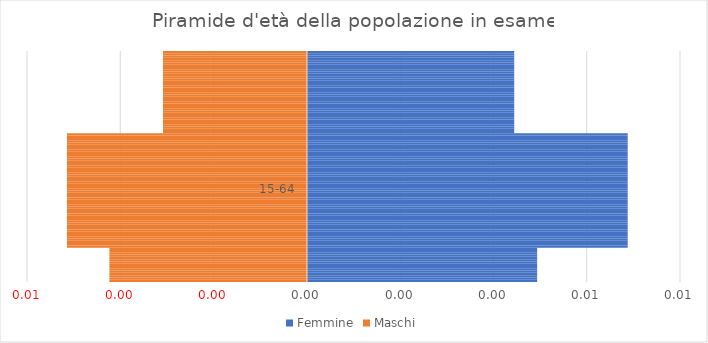
| Category | Femmine | Maschi |
|---|---|---|
|  | 0.005 | -0.004 |
|  | 0.005 | -0.004 |
|  | 0.005 | -0.004 |
|  | 0.005 | -0.004 |
|  | 0.005 | -0.004 |
|  | 0.005 | -0.004 |
|  | 0.005 | -0.004 |
| 0-14 | 0.005 | -0.004 |
|  | 0.005 | -0.004 |
|  | 0.005 | -0.004 |
|  | 0.005 | -0.004 |
|  | 0.005 | -0.004 |
|  | 0.005 | -0.004 |
|  | 0.005 | -0.004 |
|  | 0.005 | -0.004 |
|  | 0.007 | -0.005 |
|  | 0.007 | -0.005 |
|  | 0.007 | -0.005 |
|  | 0.007 | -0.005 |
|  | 0.007 | -0.005 |
|  | 0.007 | -0.005 |
|  | 0.007 | -0.005 |
|  | 0.007 | -0.005 |
|  | 0.007 | -0.005 |
|  | 0.007 | -0.005 |
|  | 0.007 | -0.005 |
|  | 0.007 | -0.005 |
|  | 0.007 | -0.005 |
|  | 0.007 | -0.005 |
|  | 0.007 | -0.005 |
|  | 0.007 | -0.005 |
|  | 0.007 | -0.005 |
|  | 0.007 | -0.005 |
|  | 0.007 | -0.005 |
|  | 0.007 | -0.005 |
|  | 0.007 | -0.005 |
|  | 0.007 | -0.005 |
|  | 0.007 | -0.005 |
|  | 0.007 | -0.005 |
|  | 0.007 | -0.005 |
| 15-64 | 0.007 | -0.005 |
|  | 0.007 | -0.005 |
|  | 0.007 | -0.005 |
|  | 0.007 | -0.005 |
|  | 0.007 | -0.005 |
|  | 0.007 | -0.005 |
|  | 0.007 | -0.005 |
|  | 0.007 | -0.005 |
|  | 0.007 | -0.005 |
|  | 0.007 | -0.005 |
|  | 0.007 | -0.005 |
|  | 0.007 | -0.005 |
|  | 0.007 | -0.005 |
|  | 0.007 | -0.005 |
|  | 0.007 | -0.005 |
|  | 0.007 | -0.005 |
|  | 0.007 | -0.005 |
|  | 0.007 | -0.005 |
|  | 0.007 | -0.005 |
|  | 0.007 | -0.005 |
|  | 0.007 | -0.005 |
|  | 0.007 | -0.005 |
|  | 0.007 | -0.005 |
|  | 0.007 | -0.005 |
|  | 0.007 | -0.005 |
|  | 0.004 | -0.003 |
|  | 0.004 | -0.003 |
|  | 0.004 | -0.003 |
|  | 0.004 | -0.003 |
|  | 0.004 | -0.003 |
|  | 0.004 | -0.003 |
|  | 0.004 | -0.003 |
|  | 0.004 | -0.003 |
|  | 0.004 | -0.003 |
|  | 0.004 | -0.003 |
|  | 0.004 | -0.003 |
|  | 0.004 | -0.003 |
|  | 0.004 | -0.003 |
|  | 0.004 | -0.003 |
|  | 0.004 | -0.003 |
|  | 0.004 | -0.003 |
|  | 0.004 | -0.003 |
| 65-99 | 0.004 | -0.003 |